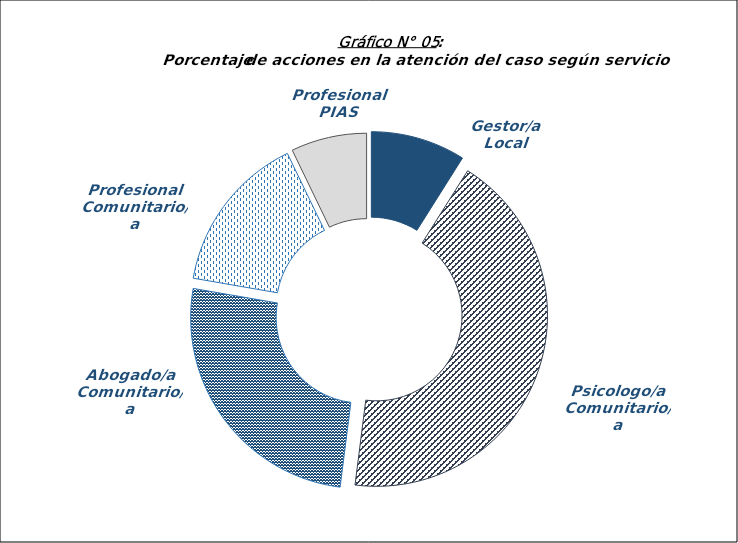
| Category | Gestor/a Local |
|---|---|
| Gestor/a Local | 405 |
| Psicologo/a Comunitario/a | 1949 |
| Abogado/a Comunitario/a | 1164 |
| Profesional Comunitario/a | 684 |
| Profesional PIAS | 324 |